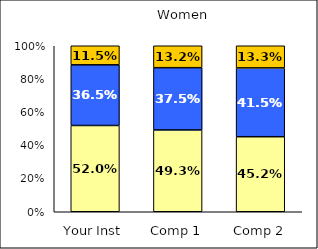
| Category | Low Academic Self-Concept | Average Academic Self-Concept | High Academic Self-Concept |
|---|---|---|---|
| Your Inst | 0.52 | 0.365 | 0.115 |
| Comp 1 | 0.493 | 0.375 | 0.132 |
| Comp 2 | 0.452 | 0.415 | 0.133 |